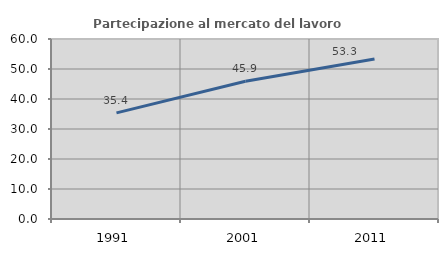
| Category | Partecipazione al mercato del lavoro  femminile |
|---|---|
| 1991.0 | 35.373 |
| 2001.0 | 45.936 |
| 2011.0 | 53.345 |